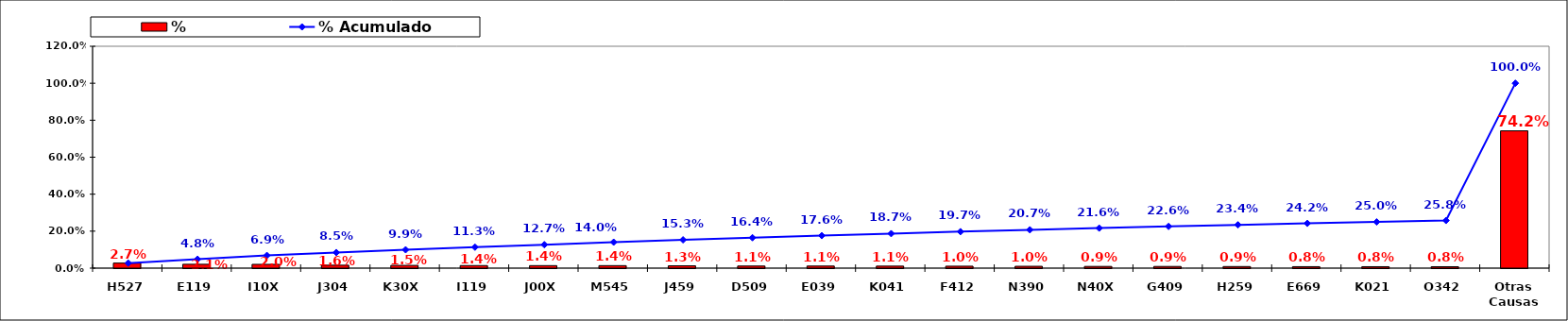
| Category | % |
|---|---|
| H527 | 0.027 |
| E119 | 0.021 |
| I10X | 0.02 |
| J304 | 0.016 |
| K30X | 0.015 |
| I119 | 0.014 |
| J00X | 0.014 |
| M545 | 0.014 |
| J459 | 0.013 |
| D509 | 0.011 |
| E039 | 0.011 |
| K041 | 0.011 |
| F412 | 0.01 |
| N390 | 0.01 |
| N40X | 0.009 |
| G409 | 0.009 |
| H259 | 0.009 |
| E669 | 0.008 |
| K021 | 0.008 |
| O342 | 0.008 |
| Otras Causas | 0.742 |